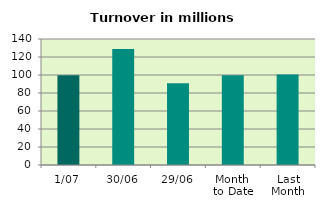
| Category | Series 0 |
|---|---|
| 1/07 | 99.854 |
| 30/06 | 128.908 |
| 29/06 | 90.923 |
| Month 
to Date | 99.854 |
| Last
Month | 100.537 |